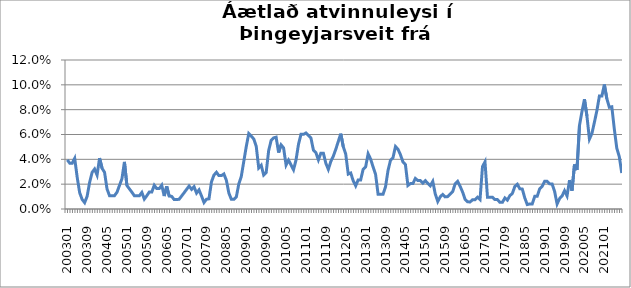
| Category | Series 0 |
|---|---|
| 200301 | 0.04 |
| 200302 | 0.037 |
| 200303 | 0.037 |
| 200304 | 0.041 |
| 200305 | 0.026 |
| 200306 | 0.013 |
| 200307 | 0.008 |
| 200308 | 0.005 |
| 200309 | 0.01 |
| 200310 | 0.021 |
| 200311 | 0.029 |
| 200312 | 0.032 |
| 200401 | 0.027 |
| 200402 | 0.041 |
| 200403 | 0.033 |
| 200404 | 0.03 |
| 200405 | 0.016 |
| 200406 | 0.011 |
| 200407 | 0.011 |
| 200408 | 0.011 |
| 200409 | 0.013 |
| 200410 | 0.019 |
| 200411 | 0.024 |
| 200412 | 0.038 |
| 200501 | 0.019 |
| 200502 | 0.016 |
| 200503 | 0.014 |
| 200504 | 0.011 |
| 200505 | 0.011 |
| 200506 | 0.011 |
| 200507 | 0.013 |
| 200508 | 0.008 |
| 200509 | 0.011 |
| 200510 | 0.014 |
| 200511 | 0.014 |
| 200512 | 0.019 |
| 200601 | 0.016 |
| 200602 | 0.016 |
| 200603 | 0.019 |
| 200604 | 0.01 |
| 200605 | 0.018 |
| 200606 | 0.01 |
| 200607 | 0.01 |
| 200608 | 0.008 |
| 200609 | 0.008 |
| 200610 | 0.008 |
| 200611 | 0.01 |
| 200612 | 0.013 |
| 200701 | 0.016 |
| 200702 | 0.018 |
| 200703 | 0.016 |
| 200704 | 0.018 |
| 200705 | 0.013 |
| 200706 | 0.015 |
| 200707 | 0.01 |
| 200708 | 0.005 |
| 200709 | 0.008 |
| 200710 | 0.008 |
| 200711 | 0.022 |
| 200712 | 0.027 |
| 200801 | 0.03 |
| 200802 | 0.027 |
| 200803 | 0.027 |
| 200804 | 0.028 |
| 200805 | 0.023 |
| 200806 | 0.013 |
| 200807 | 0.008 |
| 200808 | 0.008 |
| 200809 | 0.01 |
| 200810 | 0.02 |
| 200811 | 0.026 |
| 200812 | 0.038 |
| 200901 | 0.05 |
| 200902 | 0.061 |
| 200903 | 0.059 |
| 200904 | 0.056 |
| 200905 | 0.051 |
| 200906 | 0.033 |
| 200907 | 0.035 |
| 200908 | 0.027 |
| 200909 | 0.029 |
| 200910 | 0.047 |
| 200911 | 0.055 |
| 200912 | 0.057 |
| 201001 | 0.058 |
| 201002 | 0.045 |
| 201003 | 0.052 |
| 201004 | 0.049 |
| 201005 | 0.035 |
| 201006 | 0.039 |
| 201007 | 0.036 |
| 201008 | 0.032 |
| 201009 | 0.039 |
| 201010 | 0.052 |
| 201011 | 0.06 |
| 201012 | 0.06 |
| 201101 | 0.061 |
| 201102 | 0.059 |
| 201103 | 0.057 |
| 201104 | 0.047 |
| 201105 | 0.045 |
| 201106 | 0.04 |
| 201107 | 0.045 |
| 201108 | 0.045 |
| 201109 | 0.037 |
| 201110 | 0.032 |
| 201111 | 0.038 |
| 201112 | 0.043 |
| 201201 | 0.048 |
| 201202 | 0.054 |
| 201203 | 0.061 |
| 201204 | 0.05 |
| 201205 | 0.044 |
| 201206 | 0.028 |
| 201207 | 0.029 |
| 201208 | 0.023 |
| 201209 | 0.019 |
| 201210 | 0.023 |
| 201211 | 0.023 |
| 201212 | 0.032 |
| 201301 | 0.034 |
| 201302 | 0.044 |
| 201303 | 0.04 |
| 201304 | 0.034 |
| 201305 | 0.028 |
| 201306 | 0.012 |
| 201307 | 0.012 |
| 201308 | 0.012 |
| 201309 | 0.018 |
| 201310 | 0.031 |
| 201311 | 0.039 |
| 201312 | 0.041 |
| 201401 | 0.05 |
| 201402 | 0.048 |
| 201403 | 0.044 |
| 201404 | 0.038 |
| 201405 | 0.036 |
| 201406 | 0.019 |
| 201407 | 0.02 |
| 201408 | 0.02 |
| 201409 | 0.025 |
| 201410 | 0.023 |
| 201411 | 0.023 |
| 201412 | 0.021 |
| 201501 | 0.023 |
| 201502 | 0.021 |
| 201503 | 0.019 |
| 201504 | 0.022 |
| 201505 | 0.012 |
| 201506 | 0.006 |
| 201507 | 0.01 |
| 201508 | 0.012 |
| 201509 | 0.01 |
| 201510 | 0.01 |
| 201511 | 0.012 |
| 201512 | 0.014 |
| 201601 | 0.02 |
| 201602 | 0.022 |
| 201603 | 0.018 |
| 201604 | 0.014 |
| 201605 | 0.008 |
| 201606 | 0.006 |
| 201607 | 0.006 |
| 201608 | 0.008 |
| 201609 | 0.008 |
| 201610 | 0.01 |
| 201611 | 0.008 |
| 201612 | 0.034 |
| 201701 | 0.038 |
| 201702 | 0.009 |
| 201703 | 0.009 |
| 201704 | 0.009 |
| 201705 | 0.008 |
| 201706 | 0.008 |
| 201707 | 0.005 |
| 201708 | 0.005 |
| 201709 | 0.009 |
| 201710 | 0.007 |
| 201711 | 0.011 |
| 201712 | 0.013 |
| 201801 | 0.018 |
| 201802 | 0.02 |
| 201803 | 0.016 |
| 201804 | 0.016 |
| 201805 | 0.009 |
| 201806 | 0.004 |
| 201807 | 0.004 |
| 201808 | 0.004 |
| 201809 | 0.01 |
| 201810 | 0.01 |
| 201811 | 0.016 |
| 201812 | 0.018 |
| 201901 | 0.022 |
| 201902 | 0.022 |
| 201903 | 0.02 |
| 201904 | 0.02 |
| 201905 | 0.014 |
| 201906 | 0.004 |
| 201907 | 0.008 |
| 201908 | 0.011 |
| 201909 | 0.015 |
| 201910 | 0.011 |
| 201911 | 0.023 |
| 201912 | 0.015 |
| 202001 | 0.036 |
| 202002 | 0.031 |
| 202003 | 0.067 |
| 202004 | 0.078 |
| 202005 | 0.088 |
| 202006 | 0.075 |
| 202007 | 0.056 |
| 202008 | 0.061 |
| 202009 | 0.07 |
| 202010 | 0.079 |
| 202011 | 0.091 |
| 202012 | 0.091 |
| 202101 | 0.1 |
| 202102 | 0.089 |
| 202103 | 0.082 |
| 202104 | 0.082 |
| 202105 | 0.065 |
| 202106 | 0.049 |
| 202107 | 0.042 |
| 202108 | 0.029 |